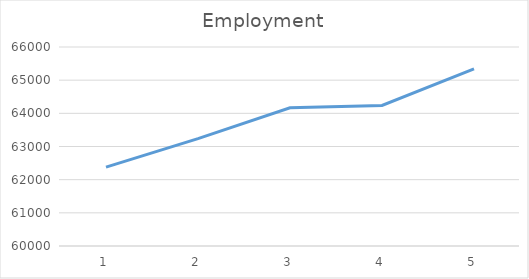
| Category | Series 0 |
|---|---|
| 0 | 62377 |
| 1 | 63237 |
| 2 | 64169 |
| 3 | 64239 |
| 4 | 65343 |